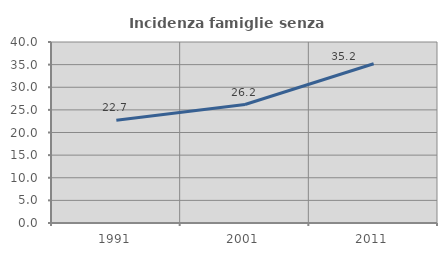
| Category | Incidenza famiglie senza nuclei |
|---|---|
| 1991.0 | 22.727 |
| 2001.0 | 26.185 |
| 2011.0 | 35.185 |